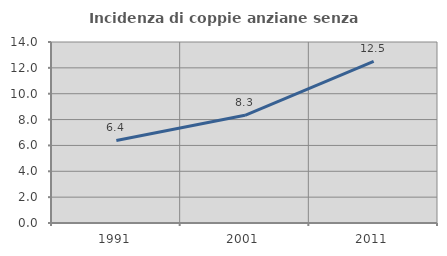
| Category | Incidenza di coppie anziane senza figli  |
|---|---|
| 1991.0 | 6.383 |
| 2001.0 | 8.333 |
| 2011.0 | 12.5 |